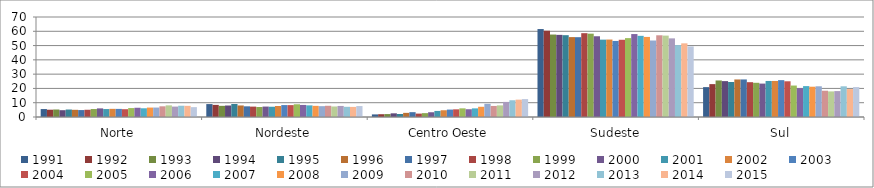
| Category | 1991 | 1992 | 1993 | 1994 | 1995 | 1996 | 1997 | 1998 | 1999 | 2000 | 2001 | 2002 | 2003 | 2004 | 2005 | 2006 | 2007 | 2008 | 2009 | 2010 | 2011 | 2012 | 2013 | 2014 | 2015 |
|---|---|---|---|---|---|---|---|---|---|---|---|---|---|---|---|---|---|---|---|---|---|---|---|---|---|
| Norte | 5.557 | 5.101 | 5.247 | 4.773 | 5.232 | 5.029 | 4.853 | 5.068 | 5.576 | 6.028 | 5.562 | 5.705 | 5.671 | 5.458 | 6.259 | 6.471 | 6.106 | 6.598 | 6.609 | 7.484 | 8.148 | 7.294 | 7.887 | 7.817 | 6.91 |
| Nordeste | 9.044 | 8.479 | 7.814 | 8.044 | 9.117 | 8.074 | 7.474 | 7.275 | 6.989 | 7.304 | 7.185 | 7.703 | 8.35 | 8.32 | 8.91 | 8.439 | 8.146 | 7.806 | 7.593 | 7.856 | 7.36 | 7.739 | 7.135 | 7.07 | 7.668 |
| Centro Oeste | 1.816 | 1.952 | 2.053 | 2.57 | 2.121 | 2.897 | 3.386 | 2.375 | 2.696 | 3.326 | 4.24 | 4.727 | 5.195 | 5.367 | 6.056 | 5.44 | 6.034 | 7.156 | 9.222 | 7.736 | 8.126 | 10.562 | 11.725 | 12.151 | 12.542 |
| Sudeste | 61.564 | 60.4 | 57.72 | 57.494 | 57.271 | 55.929 | 55.861 | 58.677 | 58.344 | 56.522 | 54.145 | 54.211 | 53.24 | 54.059 | 55.22 | 58.061 | 56.818 | 56.057 | 53.55 | 57.197 | 56.98 | 55.042 | 50.32 | 51.571 | 49.411 |
| Sul | 20.908 | 23.019 | 25.568 | 25.12 | 24.515 | 26.278 | 26.289 | 24.368 | 23.95 | 23.385 | 25.226 | 25.228 | 25.801 | 25 | 22.023 | 20.173 | 21.632 | 21.2 | 21.495 | 18.394 | 17.916 | 18.145 | 21.494 | 19.553 | 20.965 |